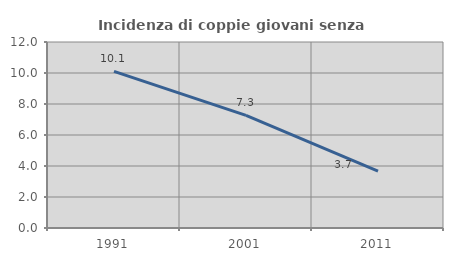
| Category | Incidenza di coppie giovani senza figli |
|---|---|
| 1991.0 | 10.106 |
| 2001.0 | 7.263 |
| 2011.0 | 3.665 |